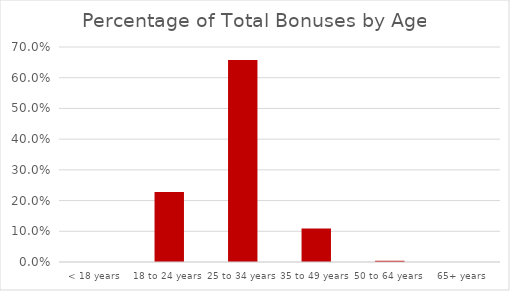
| Category | Percentage of Total Bonuses by Age (%) |
|---|---|
| < 18 years | 0 |
| 18 to 24 years | 0.228 |
| 25 to 34 years | 0.658 |
| 35 to 49 years | 0.109 |
| 50 to 64 years | 0.004 |
| 65+ years | 0 |